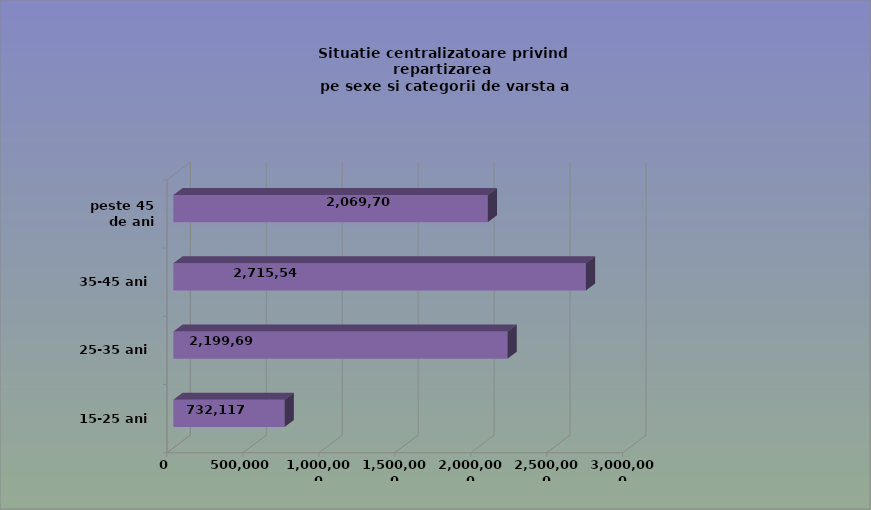
| Category | 15-25 ani 25-35 ani 35-45 ani peste 45 de ani |
|---|---|
| 15-25 ani | 732117 |
| 25-35 ani | 2199699 |
| 35-45 ani | 2715549 |
| peste 45 de ani | 2069706 |